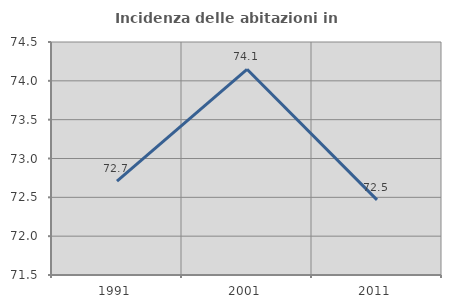
| Category | Incidenza delle abitazioni in proprietà  |
|---|---|
| 1991.0 | 72.709 |
| 2001.0 | 74.148 |
| 2011.0 | 72.467 |